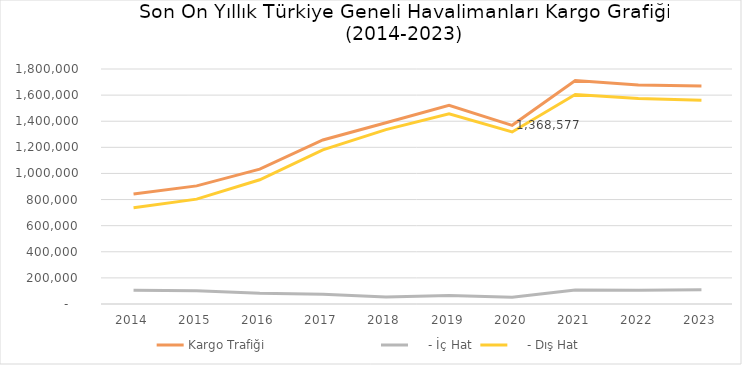
| Category | Kargo Trafiği                             |     - İç Hat |     - Dış Hat |
|---|---|---|---|
| 2014.0 | 842241.493 | 104941.1 | 737300.393 |
| 2015.0 | 904761.757 | 101447.367 | 803314.39 |
| 2016.0 | 1032943.403 | 81587.264 | 951356.139 |
| 2017.0 | 1256223.623 | 75254.445 | 1180969.178 |
| 2018.0 | 1388622.949 | 52807.454 | 1335815.495 |
| 2019.0 | 1522403.851 | 65666.663 | 1456737.188 |
| 2020.0 | 1368576.626 | 51043.286 | 1317533.34 |
| 2021.0 | 1711150.513 | 106317.12 | 1604833.393 |
| 2022.0 | 1678249.275 | 105088.467 | 1573160.808 |
| 2023.0 | 1670078.271 | 109461.163 | 1560617.108 |